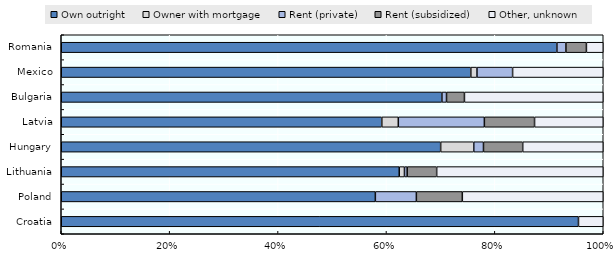
| Category | Own outright | Owner with mortgage | Rent (private) | Rent (subsidized) | Other, unknown |
|---|---|---|---|---|---|
| Croatia | 0.954 | 0 | 0 | 0 | 0.046 |
| Poland | 0.58 | 0 | 0.076 | 0.085 | 0.26 |
| Lithuania | 0.624 | 0.01 | 0.005 | 0.054 | 0.307 |
| Hungary | 0.7 | 0.061 | 0.018 | 0.072 | 0.149 |
| Latvia | 0.591 | 0.03 | 0.159 | 0.093 | 0.127 |
| Bulgaria | 0.702 | 0 | 0.009 | 0.033 | 0.256 |
| Mexico | 0.756 | 0.011 | 0.066 | 0 | 0.167 |
| Romania | 0.914 | 0 | 0.017 | 0.038 | 0.031 |